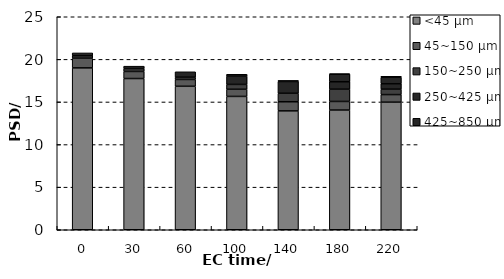
| Category | <45 μm | 45~150 μm | 150~250 μm | 250~425 μm | 425~850 μm | 850~2000 μm |
|---|---|---|---|---|---|---|
| 0.0 | 19 | 1.14 | 0.285 | 0.33 | 0 | 0 |
| 30.0 | 17.75 | 0.83 | 0.34 | 0.28 | 0 | 0 |
| 60.0 | 16.84 | 0.8 | 0.27 | 0.63 | 0 | 0 |
| 100.0 | 15.65 | 0.84 | 0.57 | 0.97 | 0.22 | 0 |
| 140.0 | 13.95 | 1.07 | 1 | 1.38 | 0.13 | 0 |
| 180.0 | 14.05 | 1.01 | 1.44 | 0.87 | 0.89 | 0.04 |
| 220.0 | 14.975 | 0.89 | 0.64 | 0.635 | 0.755 | 0.12 |